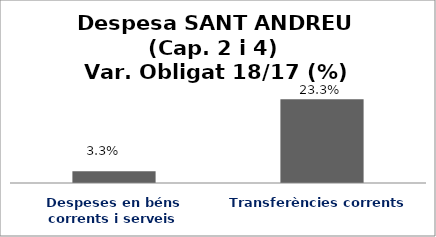
| Category | Series 0 |
|---|---|
| Despeses en béns corrents i serveis | 0.033 |
| Transferències corrents | 0.233 |